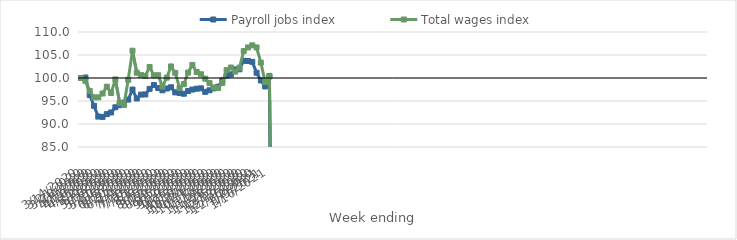
| Category | Payroll jobs index | Total wages index |
|---|---|---|
| 14/03/2020 | 100 | 100 |
| 21/03/2020 | 100.106 | 99.397 |
| 28/03/2020 | 96.31 | 97.186 |
| 04/04/2020 | 93.952 | 95.791 |
| 11/04/2020 | 91.616 | 95.787 |
| 18/04/2020 | 91.547 | 96.629 |
| 25/04/2020 | 92.146 | 98.109 |
| 02/05/2020 | 92.502 | 96.748 |
| 09/05/2020 | 93.633 | 99.694 |
| 16/05/2020 | 94.081 | 94.606 |
| 23/05/2020 | 94.646 | 94.142 |
| 30/05/2020 | 95.307 | 99.624 |
| 06/06/2020 | 97.479 | 105.925 |
| 13/06/2020 | 95.547 | 101.145 |
| 20/06/2020 | 96.39 | 100.666 |
| 27/06/2020 | 96.427 | 100.446 |
| 04/07/2020 | 97.641 | 102.385 |
| 11/07/2020 | 98.476 | 100.57 |
| 18/07/2020 | 97.822 | 100.602 |
| 25/07/2020 | 97.325 | 98.118 |
| 01/08/2020 | 97.713 | 100.077 |
| 08/08/2020 | 97.989 | 102.508 |
| 15/08/2020 | 96.871 | 101.116 |
| 22/08/2020 | 96.746 | 97.828 |
| 29/08/2020 | 96.578 | 98.654 |
| 05/09/2020 | 97.171 | 101.186 |
| 12/09/2020 | 97.489 | 102.84 |
| 19/09/2020 | 97.673 | 101.307 |
| 26/09/2020 | 97.748 | 100.817 |
| 03/10/2020 | 96.994 | 99.859 |
| 10/10/2020 | 97.329 | 98.884 |
| 17/10/2020 | 97.745 | 97.932 |
| 24/10/2020 | 98.106 | 97.82 |
| 31/10/2020 | 99.479 | 98.915 |
| 07/11/2020 | 100.54 | 101.724 |
| 14/11/2020 | 100.788 | 102.282 |
| 21/11/2020 | 101.865 | 101.39 |
| 28/11/2020 | 101.894 | 102.242 |
| 05/12/2020 | 103.743 | 105.859 |
| 12/12/2020 | 103.699 | 106.647 |
| 19/12/2020 | 103.514 | 107.106 |
| 26/12/2020 | 101.148 | 106.646 |
| 02/01/2021 | 99.46 | 103.333 |
| 09/01/2021 | 98.159 | 99.132 |
| 16/01/2021 | 100.413 | 100.329 |